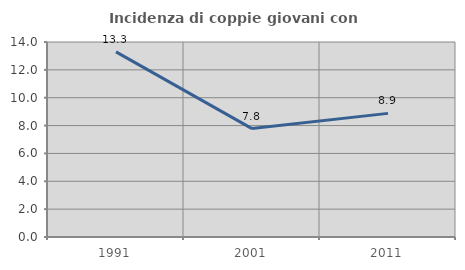
| Category | Incidenza di coppie giovani con figli |
|---|---|
| 1991.0 | 13.291 |
| 2001.0 | 7.784 |
| 2011.0 | 8.876 |